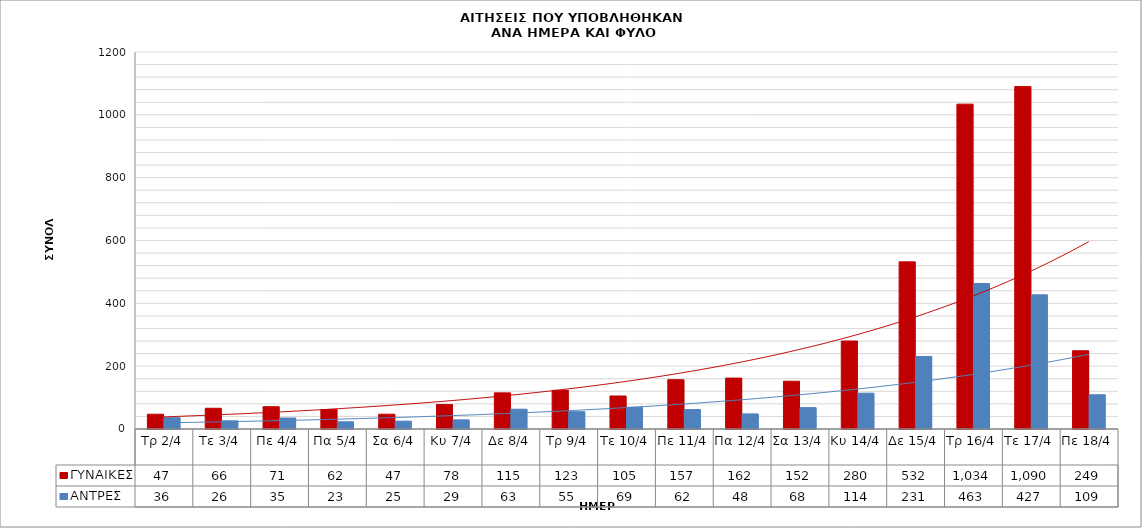
| Category | ΓΥΝΑΙΚΕΣ | ΑΝΤΡΕΣ |
|---|---|---|
| Τρ 2/4 | 47 | 36 |
| Τε 3/4 | 66 | 26 |
| Πε 4/4 | 71 | 35 |
| Πα 5/4 | 62 | 23 |
| Σα 6/4 | 47 | 25 |
| Κυ 7/4 | 78 | 29 |
| Δε 8/4 | 115 | 63 |
| Τρ 9/4 | 123 | 55 |
| Τε 10/4 | 105 | 69 |
| Πε 11/4 | 157 | 62 |
| Πα 12/4 | 162 | 48 |
| Σα 13/4 | 152 | 68 |
| Κυ 14/4 | 280 | 114 |
| Δε 15/4 | 532 | 231 |
| Τρ 16/4 | 1034 | 463 |
| Τε 17/4 | 1090 | 427 |
| Πε 18/4 | 249 | 109 |